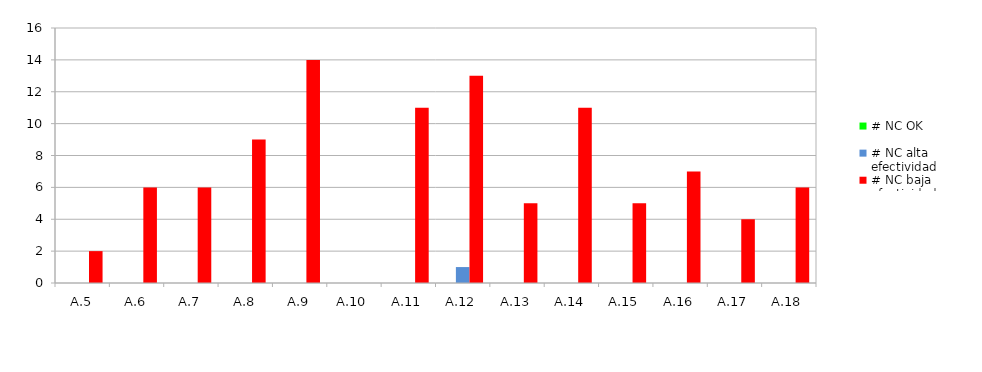
| Category | # NC OK | # NC alta efectividad | # NC baja efectividad |
|---|---|---|---|
| A.5 | 0 | 0 | 2 |
| A.6 | 0 | 0 | 6 |
| A.7 | 0 | 0 | 6 |
| A.8 | 0 | 0 | 9 |
| A.9 | 0 | 0 | 14 |
| A.10 | 0 | 0 | 0 |
| A.11 | 0 | 0 | 11 |
| A.12 | 0 | 1 | 13 |
| A.13 | 0 | 0 | 5 |
| A.14 | 0 | 0 | 11 |
| A.15 | 0 | 0 | 5 |
| A.16 | 0 | 0 | 7 |
| A.17 | 0 | 0 | 4 |
| A.18 | 0 | 0 | 6 |